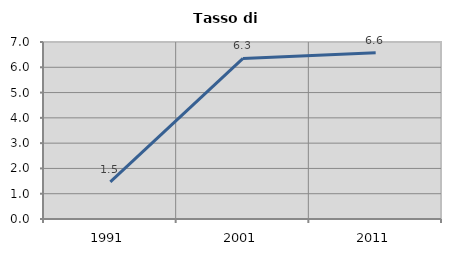
| Category | Tasso di disoccupazione   |
|---|---|
| 1991.0 | 1.471 |
| 2001.0 | 6.349 |
| 2011.0 | 6.579 |